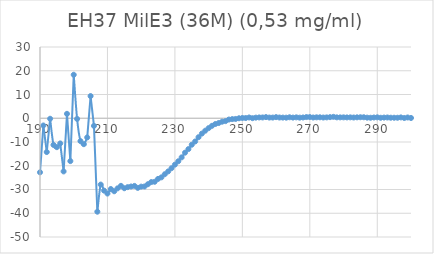
| Category | Series 0 |
|---|---|
| 300.0 | 0.114 |
| 299.0 | 0.324 |
| 298.0 | 0.111 |
| 297.0 | 0.351 |
| 296.0 | 0.211 |
| 295.0 | 0.217 |
| 294.0 | 0.225 |
| 293.0 | 0.317 |
| 292.0 | 0.286 |
| 291.0 | 0.202 |
| 290.0 | 0.388 |
| 289.0 | 0.314 |
| 288.0 | 0.212 |
| 287.0 | 0.257 |
| 286.0 | 0.418 |
| 285.0 | 0.423 |
| 284.0 | 0.384 |
| 283.0 | 0.31 |
| 282.0 | 0.377 |
| 281.0 | 0.35 |
| 280.0 | 0.376 |
| 279.0 | 0.371 |
| 278.0 | 0.382 |
| 277.0 | 0.59 |
| 276.0 | 0.459 |
| 275.0 | 0.363 |
| 274.0 | 0.305 |
| 273.0 | 0.395 |
| 272.0 | 0.391 |
| 271.0 | 0.312 |
| 270.0 | 0.503 |
| 269.0 | 0.496 |
| 268.0 | 0.323 |
| 267.0 | 0.255 |
| 266.0 | 0.373 |
| 265.0 | 0.277 |
| 264.0 | 0.408 |
| 263.0 | 0.244 |
| 262.0 | 0.273 |
| 261.0 | 0.31 |
| 260.0 | 0.467 |
| 259.0 | 0.287 |
| 258.0 | 0.295 |
| 257.0 | 0.481 |
| 256.0 | 0.338 |
| 255.0 | 0.337 |
| 254.0 | 0.254 |
| 253.0 | 0.037 |
| 252.0 | 0.323 |
| 251.0 | 0.094 |
| 250.0 | 0.121 |
| 249.0 | -0.013 |
| 248.0 | -0.295 |
| 247.0 | -0.353 |
| 246.0 | -0.545 |
| 245.0 | -1.208 |
| 244.0 | -1.449 |
| 243.0 | -2.003 |
| 242.0 | -2.423 |
| 241.0 | -3.18 |
| 240.0 | -4.156 |
| 239.0 | -5.246 |
| 238.0 | -6.455 |
| 237.0 | -7.983 |
| 236.0 | -9.782 |
| 235.0 | -11.15 |
| 234.0 | -12.985 |
| 233.0 | -14.491 |
| 232.0 | -16.465 |
| 231.0 | -18.107 |
| 230.0 | -19.539 |
| 229.0 | -21.036 |
| 228.0 | -22.384 |
| 227.0 | -23.561 |
| 226.0 | -24.88 |
| 225.0 | -25.537 |
| 224.0 | -26.744 |
| 223.0 | -26.868 |
| 222.0 | -27.773 |
| 221.0 | -28.723 |
| 220.0 | -28.794 |
| 219.0 | -29.31 |
| 218.0 | -28.495 |
| 217.0 | -28.74 |
| 216.0 | -29.001 |
| 215.0 | -29.466 |
| 214.0 | -28.466 |
| 213.0 | -29.512 |
| 212.0 | -30.739 |
| 211.0 | -29.801 |
| 210.0 | -31.702 |
| 209.0 | -30.476 |
| 208.0 | -27.931 |
| 207.0 | -39.347 |
| 206.0 | -3.213 |
| 205.0 | 9.342 |
| 204.0 | -8.08 |
| 203.0 | -10.917 |
| 202.0 | -9.626 |
| 201.0 | -0.27 |
| 200.0 | 18.31 |
| 199.0 | -18.044 |
| 198.0 | 1.861 |
| 197.0 | -22.386 |
| 196.0 | -10.6 |
| 195.0 | -12.177 |
| 194.0 | -11.228 |
| 193.0 | -0.212 |
| 192.0 | -14.228 |
| 191.0 | -3.049 |
| 190.0 | -22.765 |